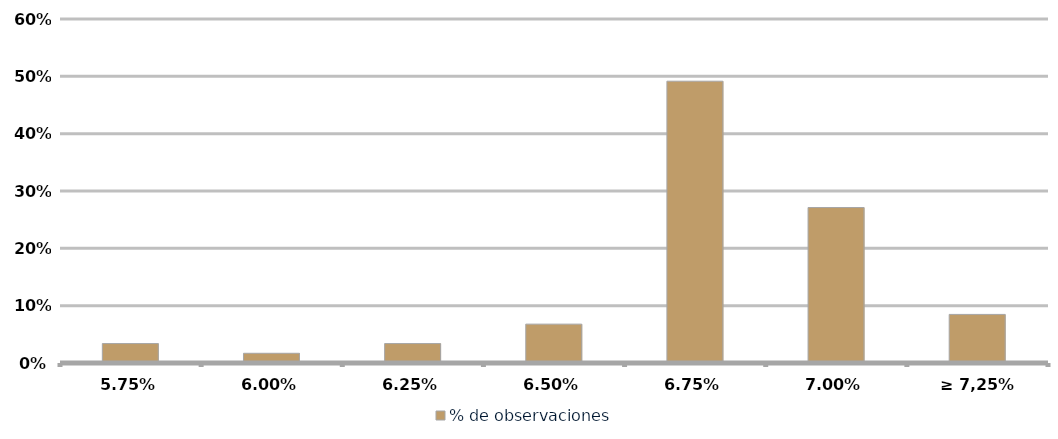
| Category | % de observaciones  |
|---|---|
| 5.75% | 0.034 |
| 6.00% | 0.017 |
| 6.25% | 0.034 |
| 6.50% | 0.068 |
| 6.75% | 0.492 |
| 7.00% | 0.271 |
| ≥ 7,25% | 0.085 |